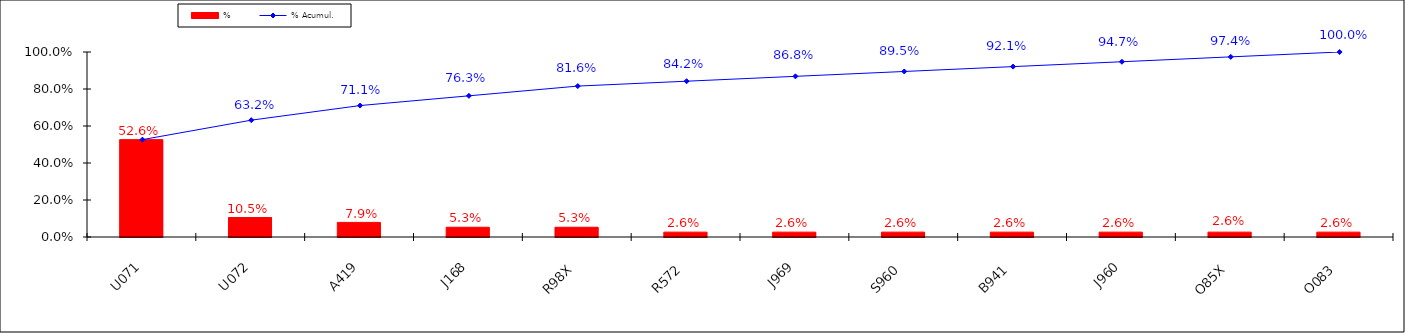
| Category | % |
|---|---|
| U071 | 0.526 |
| U072 | 0.105 |
| A419 | 0.079 |
| J168 | 0.053 |
| R98X | 0.053 |
| R572 | 0.026 |
| J969 | 0.026 |
| S960 | 0.026 |
| B941 | 0.026 |
| J960 | 0.026 |
| O85X | 0.026 |
| O083 | 0.026 |